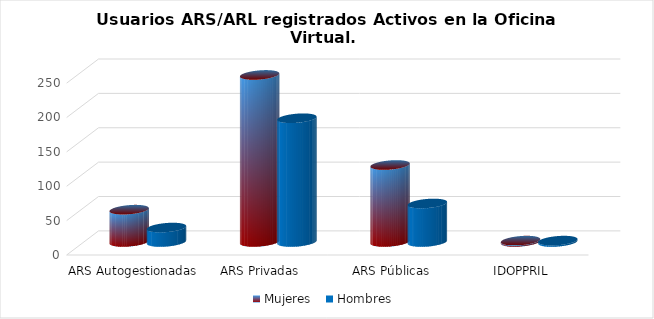
| Category | Mujeres | Hombres |
|---|---|---|
| ARS Autogestionadas | 47 | 21 |
| ARS Privadas | 243 | 180 |
| ARS Públicas | 112 | 56 |
| IDOPPRIL | 2 | 2 |